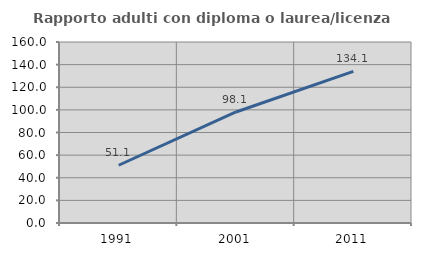
| Category | Rapporto adulti con diploma o laurea/licenza media  |
|---|---|
| 1991.0 | 51.056 |
| 2001.0 | 98.143 |
| 2011.0 | 134.078 |